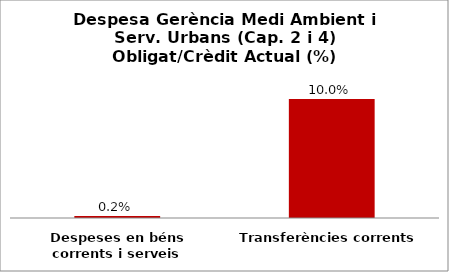
| Category | Series 0 |
|---|---|
| Despeses en béns corrents i serveis | 0.002 |
| Transferències corrents | 0.1 |